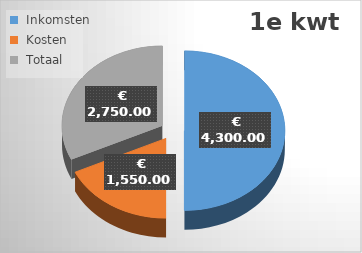
| Category | 1e |
|---|---|
|  Inkomsten  | 4300 |
|  Kosten  | 1550 |
|  Totaal  | 2750 |